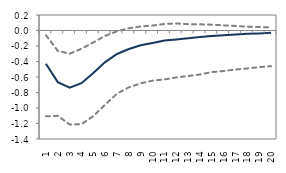
| Category | lower bound | median | upper bound |
|---|---|---|---|
| 1.0 | -1.107 | -0.428 | -0.061 |
| 2.0 | -1.101 | -0.666 | -0.262 |
| 3.0 | -1.213 | -0.738 | -0.299 |
| 4.0 | -1.208 | -0.679 | -0.235 |
| 5.0 | -1.105 | -0.55 | -0.154 |
| 6.0 | -0.956 | -0.408 | -0.07 |
| 7.0 | -0.815 | -0.303 | -0.01 |
| 8.0 | -0.733 | -0.239 | 0.029 |
| 9.0 | -0.682 | -0.191 | 0.053 |
| 10.0 | -0.646 | -0.161 | 0.063 |
| 11.0 | -0.631 | -0.13 | 0.084 |
| 12.0 | -0.605 | -0.115 | 0.091 |
| 13.0 | -0.587 | -0.099 | 0.082 |
| 14.0 | -0.568 | -0.084 | 0.08 |
| 15.0 | -0.536 | -0.071 | 0.075 |
| 16.0 | -0.523 | -0.061 | 0.066 |
| 17.0 | -0.503 | -0.052 | 0.059 |
| 18.0 | -0.49 | -0.043 | 0.049 |
| 19.0 | -0.472 | -0.038 | 0.045 |
| 20.0 | -0.46 | -0.031 | 0.04 |